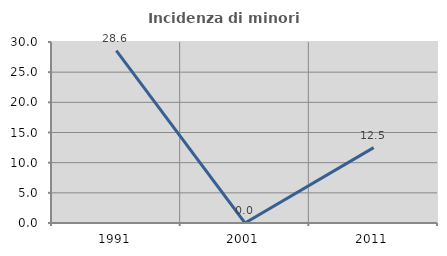
| Category | Incidenza di minori stranieri |
|---|---|
| 1991.0 | 28.571 |
| 2001.0 | 0 |
| 2011.0 | 12.5 |